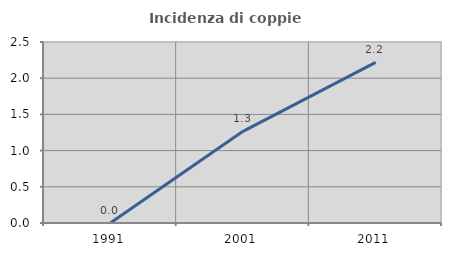
| Category | Incidenza di coppie miste |
|---|---|
| 1991.0 | 0 |
| 2001.0 | 1.266 |
| 2011.0 | 2.218 |